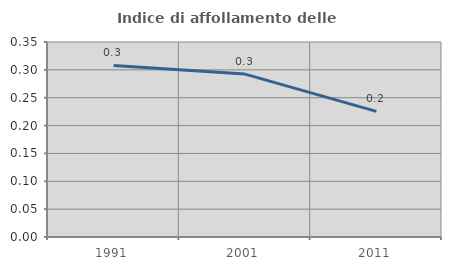
| Category | Indice di affollamento delle abitazioni  |
|---|---|
| 1991.0 | 0.308 |
| 2001.0 | 0.292 |
| 2011.0 | 0.225 |